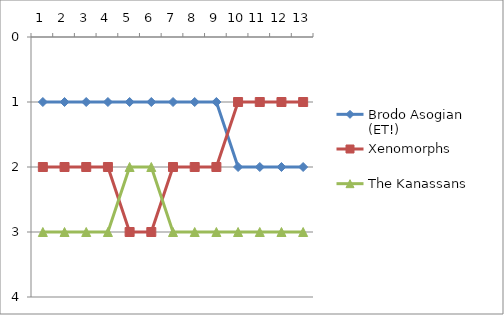
| Category | Brodo Asogian (ET!) | Xenomorphs | The Kanassans |
|---|---|---|---|
| 0 | 1 | 2 | 3 |
| 1 | 1 | 2 | 3 |
| 2 | 1 | 2 | 3 |
| 3 | 1 | 2 | 3 |
| 4 | 1 | 3 | 2 |
| 5 | 1 | 3 | 2 |
| 6 | 1 | 2 | 3 |
| 7 | 1 | 2 | 3 |
| 8 | 1 | 2 | 3 |
| 9 | 2 | 1 | 3 |
| 10 | 2 | 1 | 3 |
| 11 | 2 | 1 | 3 |
| 12 | 2 | 1 | 3 |